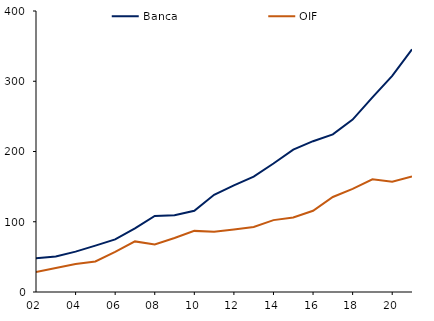
| Category | Banca | OIF |
|---|---|---|
| 2002-01-01 | 48139.642 | 28334.72 |
| 2003-01-01 | 50471.898 | 34074.784 |
| 2004-01-01 | 57458.265 | 39852.586 |
| 2005-01-01 | 66062.953 | 43391.74 |
| 2006-01-01 | 74918.407 | 57058.436 |
| 2007-01-01 | 90672.864 | 72011.089 |
| 2008-01-01 | 108326.807 | 67566.576 |
| 2009-01-01 | 109138.122 | 76919.088 |
| 2010-01-01 | 115652.953 | 86999.923 |
| 2011-01-01 | 138465.16 | 85770.64 |
| 2012-01-01 | 151743.805 | 88976.387 |
| 2013-01-01 | 164239.057 | 92539.065 |
| 2014-01-01 | 182875.225 | 102331.031 |
| 2015-01-01 | 202754.398 | 106126.352 |
| 2016-01-01 | 214669.541 | 115677.527 |
| 2017-01-01 | 224363.366 | 135301.183 |
| 2018-01-01 | 245420.95 | 146888.219 |
| 2019-01-01 | 277141.623 | 160353.341 |
| 2020-01-01 | 307536.113 | 156944.465 |
| 2021-01-01 | 345569.772 | 164477.471 |